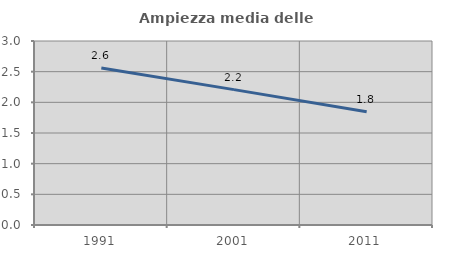
| Category | Ampiezza media delle famiglie |
|---|---|
| 1991.0 | 2.56 |
| 2001.0 | 2.207 |
| 2011.0 | 1.848 |